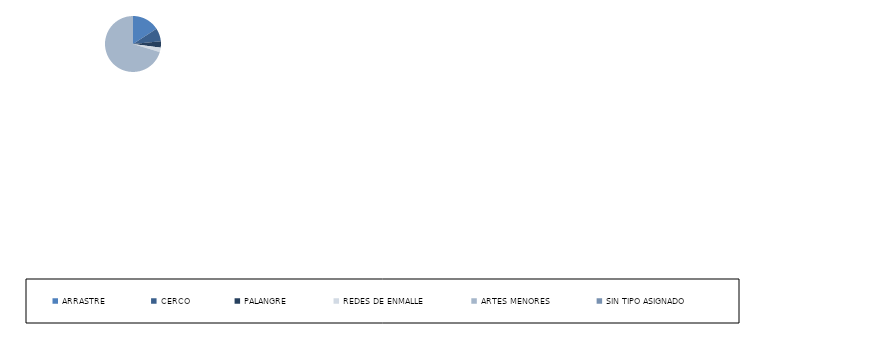
| Category | Series 0 |
|---|---|
| ARRASTRE | 104 |
| CERCO | 50 |
| PALANGRE | 24 |
| REDES DE ENMALLE | 17 |
| ARTES MENORES | 462 |
| SIN TIPO ASIGNADO | 0 |